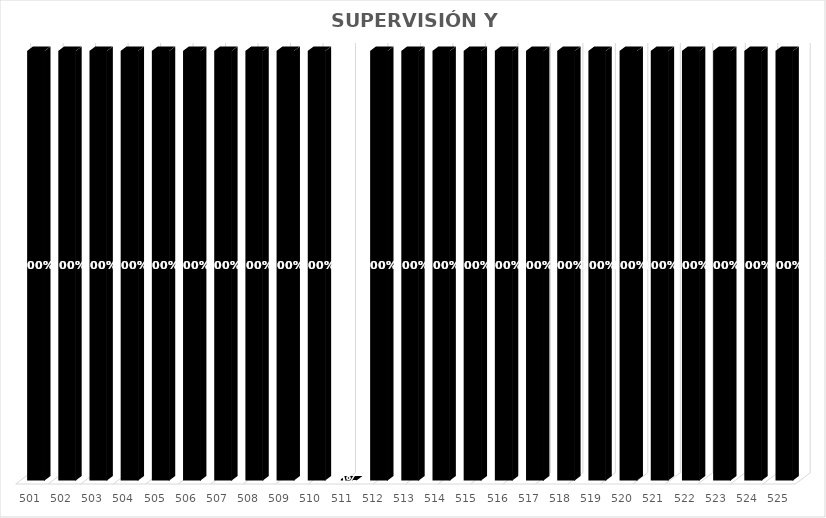
| Category | % Avance |
|---|---|
| 501.0 | 1 |
| 502.0 | 1 |
| 503.0 | 1 |
| 504.0 | 1 |
| 505.0 | 1 |
| 506.0 | 1 |
| 507.0 | 1 |
| 508.0 | 1 |
| 509.0 | 1 |
| 510.0 | 1 |
| 511.0 | 0 |
| 512.0 | 1 |
| 513.0 | 1 |
| 514.0 | 1 |
| 515.0 | 1 |
| 516.0 | 1 |
| 517.0 | 1 |
| 518.0 | 1 |
| 519.0 | 1 |
| 520.0 | 1 |
| 521.0 | 1 |
| 522.0 | 1 |
| 523.0 | 1 |
| 524.0 | 1 |
| 525.0 | 1 |